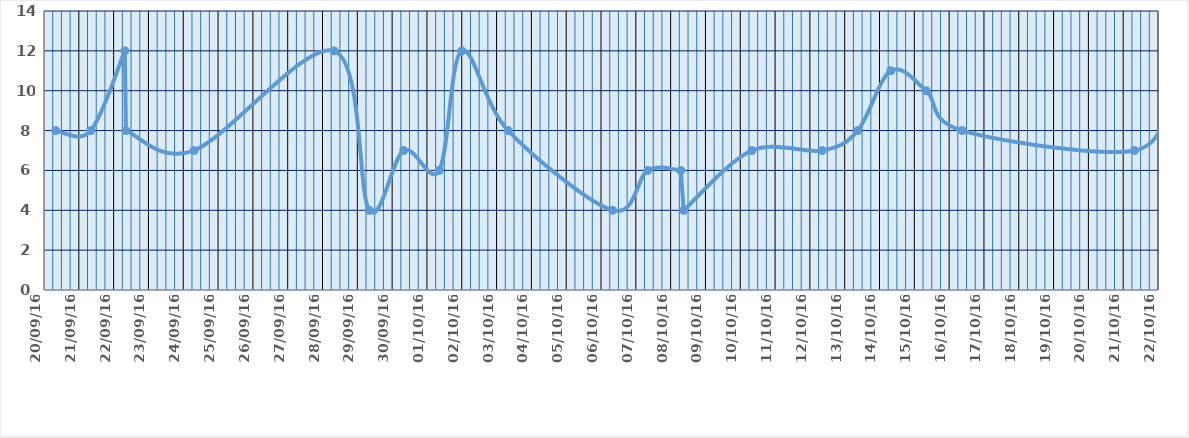
| Category | Series 0 |
|---|---|
| 42633.333333333336 | 8 |
| 42634.34375 | 8 |
| 42635.322916666664 | 12 |
| 42635.354166666664 | 8 |
| 42637.3125 | 7 |
| 42641.333333333336 | 12 |
| 42642.34375 | 4 |
| 42643.333333333336 | 7 |
| 42644.354166666664 | 6 |
| 42645.0 | 12 |
| 42646.333333333336 | 8 |
| 42649.333333333336 | 4 |
| 42650.34375 | 6 |
| 42651.291666666664 | 6 |
| 42651.375 | 4 |
| 42653.333333333336 | 7 |
| 42655.354166666664 | 7 |
| 42656.375 | 8 |
| 42657.322916666664 | 11 |
| 42658.34375 | 10 |
| 42659.375 | 8 |
| 42664.322916666664 | 7 |
| 42665.333333333336 | 10 |